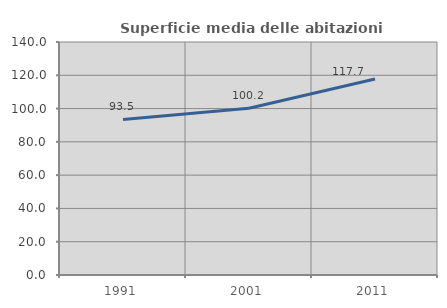
| Category | Superficie media delle abitazioni occupate |
|---|---|
| 1991.0 | 93.502 |
| 2001.0 | 100.206 |
| 2011.0 | 117.734 |